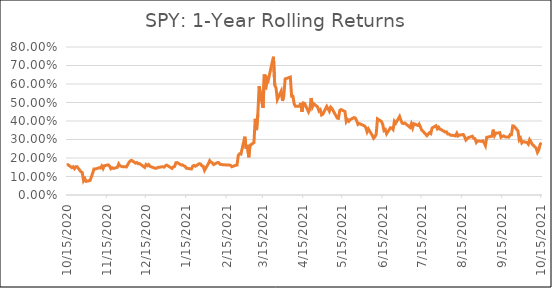
| Category | Series 0 |
|---|---|
| 10/15/20 | 0.163 |
| 10/16/20 | 0.164 |
| 10/19/20 | 0.148 |
| 10/20/20 | 0.152 |
| 10/21/20 | 0.142 |
| 10/22/20 | 0.153 |
| 10/23/20 | 0.153 |
| 10/26/20 | 0.125 |
| 10/27/20 | 0.121 |
| 10/28/20 | 0.077 |
| 10/29/20 | 0.088 |
| 10/30/20 | 0.074 |
| 11/2/20 | 0.079 |
| 11/3/20 | 0.098 |
| 11/4/20 | 0.118 |
| 11/5/20 | 0.141 |
| 11/6/20 | 0.14 |
| 11/9/20 | 0.148 |
| 11/10/20 | 0.146 |
| 11/11/20 | 0.157 |
| 11/12/20 | 0.143 |
| 11/13/20 | 0.159 |
| 11/16/20 | 0.163 |
| 11/17/20 | 0.157 |
| 11/18/20 | 0.142 |
| 11/19/20 | 0.147 |
| 11/20/20 | 0.143 |
| 11/23/20 | 0.15 |
| 11/24/20 | 0.168 |
| 11/25/20 | 0.157 |
| 11/27/20 | 0.153 |
| 11/30/20 | 0.152 |
| 12/1/20 | 0.165 |
| 12/2/20 | 0.177 |
| 12/3/20 | 0.185 |
| 12/4/20 | 0.187 |
| 12/7/20 | 0.172 |
| 12/8/20 | 0.176 |
| 12/9/20 | 0.169 |
| 12/10/20 | 0.17 |
| 12/11/20 | 0.165 |
| 12/14/20 | 0.149 |
| 12/15/20 | 0.165 |
| 12/16/20 | 0.159 |
| 12/17/20 | 0.165 |
| 12/18/20 | 0.155 |
| 12/21/20 | 0.147 |
| 12/22/20 | 0.145 |
| 12/23/20 | 0.144 |
| 12/24/20 | 0.149 |
| 12/28/20 | 0.153 |
| 12/29/20 | 0.151 |
| 12/30/20 | 0.159 |
| 12/31/20 | 0.162 |
| 1/4/21 | 0.144 |
| 1/5/21 | 0.152 |
| 1/6/21 | 0.154 |
| 1/7/21 | 0.175 |
| 1/8/21 | 0.175 |
| 1/11/21 | 0.163 |
| 1/12/21 | 0.163 |
| 1/13/21 | 0.158 |
| 1/14/21 | 0.156 |
| 1/15/21 | 0.145 |
| 1/19/21 | 0.141 |
| 1/20/21 | 0.156 |
| 1/21/21 | 0.16 |
| 1/22/21 | 0.156 |
| 1/25/21 | 0.169 |
| 1/26/21 | 0.167 |
| 1/27/21 | 0.157 |
| 1/28/21 | 0.155 |
| 1/29/21 | 0.133 |
| 2/1/21 | 0.169 |
| 2/2/21 | 0.186 |
| 2/3/21 | 0.178 |
| 2/4/21 | 0.174 |
| 2/5/21 | 0.165 |
| 2/8/21 | 0.176 |
| 2/9/21 | 0.175 |
| 2/10/21 | 0.166 |
| 2/11/21 | 0.165 |
| 2/12/21 | 0.164 |
| 2/16/21 | 0.162 |
| 2/17/21 | 0.162 |
| 2/18/21 | 0.16 |
| 2/19/21 | 0.153 |
| 2/22/21 | 0.161 |
| 2/23/21 | 0.162 |
| 2/24/21 | 0.215 |
| 2/25/21 | 0.223 |
| 2/26/21 | 0.221 |
| 3/1/21 | 0.315 |
| 3/2/21 | 0.251 |
| 3/3/21 | 0.27 |
| 3/4/21 | 0.204 |
| 3/5/21 | 0.268 |
| 3/8/21 | 0.283 |
| 3/9/21 | 0.412 |
| 3/10/21 | 0.351 |
| 3/11/21 | 0.434 |
| 3/12/21 | 0.588 |
| 3/15/21 | 0.472 |
| 3/16/21 | 0.651 |
| 3/17/21 | 0.571 |
| 3/18/21 | 0.631 |
| 3/19/21 | 0.619 |
| 3/22/21 | 0.716 |
| 3/23/21 | 0.747 |
| 3/24/21 | 0.594 |
| 3/25/21 | 0.579 |
| 3/26/21 | 0.516 |
| 3/29/21 | 0.562 |
| 3/30/21 | 0.509 |
| 3/31/21 | 0.538 |
| 4/1/21 | 0.628 |
| 4/5/21 | 0.637 |
| 4/6/21 | 0.533 |
| 4/7/21 | 0.534 |
| 4/8/21 | 0.491 |
| 4/9/21 | 0.479 |
| 4/12/21 | 0.48 |
| 4/13/21 | 0.498 |
| 4/14/21 | 0.45 |
| 4/15/21 | 0.497 |
| 4/16/21 | 0.495 |
| 4/19/21 | 0.449 |
| 4/20/21 | 0.464 |
| 4/21/21 | 0.524 |
| 4/22/21 | 0.477 |
| 4/23/21 | 0.493 |
| 4/26/21 | 0.476 |
| 4/27/21 | 0.455 |
| 4/28/21 | 0.461 |
| 4/29/21 | 0.433 |
| 4/30/21 | 0.437 |
| 5/3/21 | 0.479 |
| 5/4/21 | 0.466 |
| 5/5/21 | 0.453 |
| 5/6/21 | 0.474 |
| 5/7/21 | 0.467 |
| 5/10/21 | 0.429 |
| 5/11/21 | 0.416 |
| 5/12/21 | 0.414 |
| 5/13/21 | 0.457 |
| 5/14/21 | 0.462 |
| 5/17/21 | 0.451 |
| 5/18/21 | 0.396 |
| 5/19/21 | 0.407 |
| 5/20/21 | 0.399 |
| 5/21/21 | 0.407 |
| 5/24/21 | 0.419 |
| 5/25/21 | 0.416 |
| 5/26/21 | 0.401 |
| 5/27/21 | 0.381 |
| 5/28/21 | 0.386 |
| 6/1/21 | 0.373 |
| 6/2/21 | 0.364 |
| 6/3/21 | 0.341 |
| 6/4/21 | 0.357 |
| 6/7/21 | 0.322 |
| 6/8/21 | 0.307 |
| 6/9/21 | 0.314 |
| 6/10/21 | 0.328 |
| 6/11/21 | 0.411 |
| 6/14/21 | 0.398 |
| 6/15/21 | 0.382 |
| 6/16/21 | 0.349 |
| 6/17/21 | 0.354 |
| 6/18/21 | 0.331 |
| 6/21/21 | 0.364 |
| 6/22/21 | 0.362 |
| 6/23/21 | 0.354 |
| 6/24/21 | 0.398 |
| 6/25/21 | 0.388 |
| 6/28/21 | 0.425 |
| 6/29/21 | 0.405 |
| 6/30/21 | 0.388 |
| 7/1/21 | 0.386 |
| 7/2/21 | 0.389 |
| 7/6/21 | 0.365 |
| 7/7/21 | 0.385 |
| 7/8/21 | 0.363 |
| 7/9/21 | 0.385 |
| 7/12/21 | 0.376 |
| 7/13/21 | 0.384 |
| 7/14/21 | 0.368 |
| 7/15/21 | 0.351 |
| 7/16/21 | 0.345 |
| 7/19/21 | 0.321 |
| 7/20/21 | 0.329 |
| 7/21/21 | 0.337 |
| 7/22/21 | 0.332 |
| 7/23/21 | 0.362 |
| 7/26/21 | 0.374 |
| 7/27/21 | 0.358 |
| 7/28/21 | 0.366 |
| 7/29/21 | 0.355 |
| 7/30/21 | 0.354 |
| 8/2/21 | 0.34 |
| 8/3/21 | 0.342 |
| 8/4/21 | 0.33 |
| 8/5/21 | 0.33 |
| 8/6/21 | 0.324 |
| 8/9/21 | 0.321 |
| 8/10/21 | 0.319 |
| 8/11/21 | 0.333 |
| 8/12/21 | 0.319 |
| 8/13/21 | 0.324 |
| 8/16/21 | 0.327 |
| 8/17/21 | 0.314 |
| 8/18/21 | 0.297 |
| 8/19/21 | 0.304 |
| 8/20/21 | 0.311 |
| 8/23/21 | 0.317 |
| 8/24/21 | 0.306 |
| 8/25/21 | 0.305 |
| 8/26/21 | 0.284 |
| 8/27/21 | 0.293 |
| 8/30/21 | 0.29 |
| 8/31/21 | 0.293 |
| 9/1/21 | 0.281 |
| 9/2/21 | 0.267 |
| 9/3/21 | 0.312 |
| 9/7/21 | 0.318 |
| 9/8/21 | 0.353 |
| 9/9/21 | 0.321 |
| 9/10/21 | 0.334 |
| 9/13/21 | 0.337 |
| 9/14/21 | 0.312 |
| 9/15/21 | 0.317 |
| 9/16/21 | 0.32 |
| 9/17/21 | 0.314 |
| 9/20/21 | 0.313 |
| 9/21/21 | 0.326 |
| 9/22/21 | 0.326 |
| 9/23/21 | 0.374 |
| 9/24/21 | 0.372 |
| 9/27/21 | 0.347 |
| 9/28/21 | 0.298 |
| 9/29/21 | 0.307 |
| 9/30/21 | 0.281 |
| 10/1/21 | 0.288 |
| 10/4/21 | 0.284 |
| 10/5/21 | 0.275 |
| 10/6/21 | 0.298 |
| 10/7/21 | 0.287 |
| 10/8/21 | 0.274 |
| 10/11/21 | 0.253 |
| 10/12/21 | 0.23 |
| 10/13/21 | 0.243 |
| 10/14/21 | 0.272 |
| 10/15/21 | 0.283 |